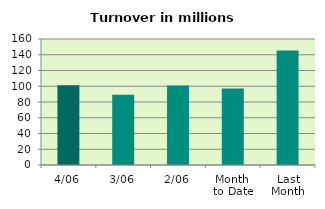
| Category | Series 0 |
|---|---|
| 4/06 | 101.133 |
| 3/06 | 89.183 |
| 2/06 | 100.826 |
| Month 
to Date | 97.01 |
| Last
Month | 145.388 |